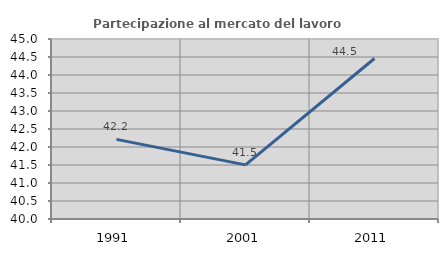
| Category | Partecipazione al mercato del lavoro  femminile |
|---|---|
| 1991.0 | 42.212 |
| 2001.0 | 41.503 |
| 2011.0 | 44.458 |